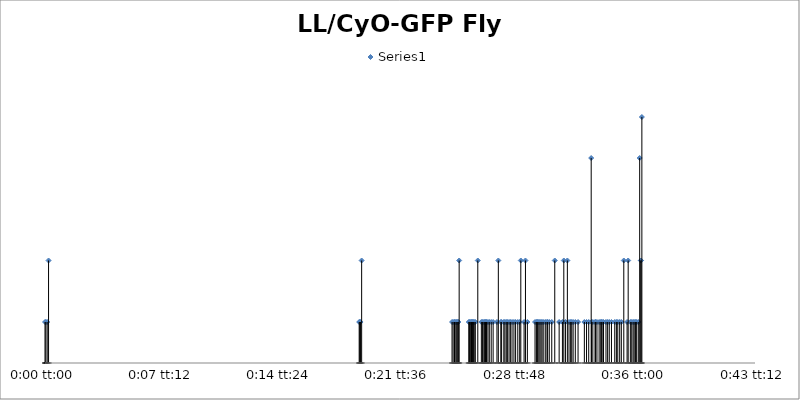
| Category | Series 0 |
|---|---|
| 0.0 | 2 |
| 3.472222222222765e-05 | 2 |
| 9.259259259261632e-05 | 2 |
| 0.00015046296296297723 | 5 |
| 0.013275462962962975 | 2 |
| 0.013298611111111122 | 2 |
| 0.01333333333333335 | 2 |
| 0.01337962962962963 | 5 |
| 0.01719907407407409 | 2 |
| 0.01724537037037037 | 2 |
| 0.017303240740740744 | 2 |
| 0.017326388888888905 | 2 |
| 0.0173726851851852 | 2 |
| 0.017407407407407413 | 2 |
| 0.01744212962962964 | 2 |
| 0.017465277777777788 | 2 |
| 0.0175 | 5 |
| 0.017905092592592597 | 2 |
| 0.017939814814814825 | 2 |
| 0.01798611111111112 | 2 |
| 0.018020833333333347 | 2 |
| 0.018043981481481494 | 2 |
| 0.01806712962962964 | 2 |
| 0.018101851851851855 | 2 |
| 0.018136574074074083 | 2 |
| 0.01818287037037039 | 2 |
| 0.018287037037037046 | 5 |
| 0.018437499999999996 | 2 |
| 0.018483796296296304 | 2 |
| 0.01854166666666668 | 2 |
| 0.018576388888888906 | 2 |
| 0.01861111111111112 | 2 |
| 0.018634259259259267 | 2 |
| 0.018657407407407428 | 2 |
| 0.01871527777777779 | 2 |
| 0.018773148148148164 | 2 |
| 0.018854166666666672 | 2 |
| 0.018935185185185194 | 2 |
| 0.019097222222222238 | 2 |
| 0.0191550925925926 | 5 |
| 0.01925925925925928 | 2 |
| 0.01929398148148148 | 2 |
| 0.01938657407407407 | 2 |
| 0.019432870370370378 | 2 |
| 0.019490740740740753 | 2 |
| 0.019537037037037047 | 2 |
| 0.019606481481481502 | 2 |
| 0.019664351851851863 | 2 |
| 0.01973379629629632 | 2 |
| 0.019814814814814827 | 2 |
| 0.019884259259259268 | 2 |
| 0.01997685185185187 | 2 |
| 0.02005787037037038 | 2 |
| 0.020104166666666673 | 5 |
| 0.020243055555555556 | 2 |
| 0.020300925925925944 | 5 |
| 0.020381944444444453 | 2 |
| 0.020706018518518526 | 2 |
| 0.0207638888888889 | 2 |
| 0.020798611111111115 | 2 |
| 0.020821759259259262 | 2 |
| 0.02086805555555557 | 2 |
| 0.020914351851851865 | 2 |
| 0.02096064814814816 | 2 |
| 0.021006944444444453 | 2 |
| 0.021076388888888895 | 2 |
| 0.02115740740740743 | 2 |
| 0.02121527777777779 | 2 |
| 0.02123842592592594 | 2 |
| 0.02130787037037038 | 2 |
| 0.021412037037037035 | 2 |
| 0.02153935185185185 | 5 |
| 0.021724537037037056 | 2 |
| 0.02186342592592594 | 2 |
| 0.0219212962962963 | 5 |
| 0.02199074074074074 | 2 |
| 0.022071759259259277 | 5 |
| 0.022141203703703705 | 2 |
| 0.02221064814814816 | 2 |
| 0.022256944444444454 | 2 |
| 0.02231481481481483 | 2 |
| 0.022407407407407418 | 2 |
| 0.022523148148148153 | 2 |
| 0.022789351851851866 | 2 |
| 0.022881944444444455 | 2 |
| 0.022974537037037043 | 2 |
| 0.023078703703703726 | 10 |
| 0.02309027777777778 | 2 |
| 0.023148148148148168 | 2 |
| 0.023240740740740756 | 2 |
| 0.023263888888888903 | 2 |
| 0.023321759259259264 | 2 |
| 0.023414351851851867 | 2 |
| 0.023483796296296308 | 2 |
| 0.023506944444444455 | 2 |
| 0.023541666666666683 | 2 |
| 0.023599537037037044 | 2 |
| 0.023703703703703713 | 2 |
| 0.023773148148148168 | 2 |
| 0.02384259259259261 | 2 |
| 0.023935185185185198 | 2 |
| 0.02407407407407408 | 2 |
| 0.024143518518518522 | 2 |
| 0.024201388888888897 | 2 |
| 0.02428240740740742 | 2 |
| 0.024351851851851847 | 2 |
| 0.02445601851851853 | 5 |
| 0.024594907407407413 | 2 |
| 0.024641203703703707 | 5 |
| 0.024733796296296323 | 2 |
| 0.024791666666666684 | 2 |
| 0.024849537037037045 | 2 |
| 0.02489583333333334 | 2 |
| 0.024953703703703728 | 2 |
| 0.02500000000000001 | 2 |
| 0.025069444444444464 | 2 |
| 0.025127314814814825 | 10 |
| 0.025173611111111133 | 5 |
| 0.0251851851851852 | 5 |
| 0.025219907407407413 | 12 |